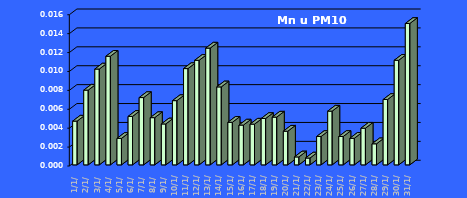
| Category | Mn u PM10 [µg/m3] |
|---|---|
| 2023-01-01 | 0.005 |
| 2023-01-02 | 0.008 |
| 2023-01-03 | 0.01 |
| 2023-01-04 | 0.011 |
| 2023-01-05 | 0.003 |
| 2023-01-06 | 0.005 |
| 2023-01-07 | 0.007 |
| 2023-01-08 | 0.005 |
| 2023-01-09 | 0.004 |
| 2023-01-10 | 0.007 |
| 2023-01-11 | 0.01 |
| 2023-01-12 | 0.011 |
| 2023-01-13 | 0.012 |
| 2023-01-14 | 0.008 |
| 2023-01-15 | 0.005 |
| 2023-01-16 | 0.004 |
| 2023-01-17 | 0.004 |
| 2023-01-18 | 0.005 |
| 2023-01-19 | 0.005 |
| 2023-01-20 | 0.004 |
| 2023-01-21 | 0.001 |
| 2023-01-22 | 0.001 |
| 2023-01-23 | 0.003 |
| 2023-01-24 | 0.006 |
| 2023-01-25 | 0.003 |
| 2023-01-26 | 0.003 |
| 2023-01-27 | 0.004 |
| 2023-01-28 | 0.002 |
| 2023-01-29 | 0.007 |
| 2023-01-30 | 0.011 |
| 2023-01-31 | 0.015 |